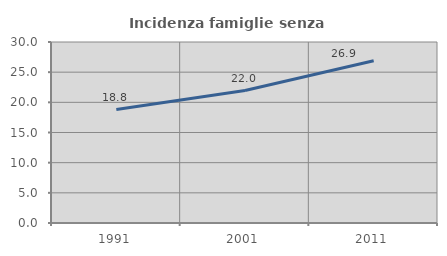
| Category | Incidenza famiglie senza nuclei |
|---|---|
| 1991.0 | 18.81 |
| 2001.0 | 21.951 |
| 2011.0 | 26.889 |